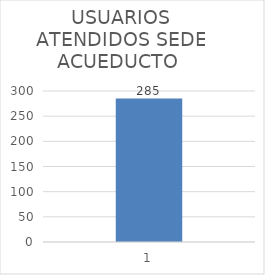
| Category | AGOSTO |
|---|---|
| 0 | 285 |